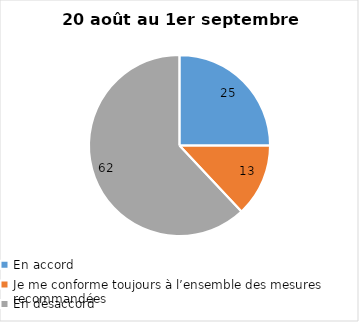
| Category | Series 0 |
|---|---|
| En accord | 25 |
| Je me conforme toujours à l’ensemble des mesures recommandées | 13 |
| En désaccord | 62 |